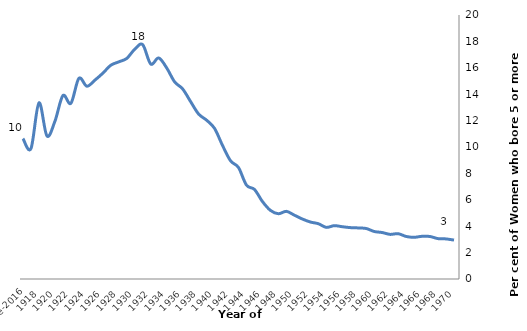
| Category | Series 0 |
|---|---|
| 1970 | 2.946 |
| 1969 | 3.037 |
| 1968 | 3.058 |
| 1967 | 3.218 |
| 1966 | 3.235 |
| 1965 | 3.158 |
| 1964 | 3.223 |
| 1963 | 3.433 |
| 1962 | 3.38 |
| 1961 | 3.522 |
| 1960 | 3.6 |
| 1959 | 3.825 |
| 1958 | 3.869 |
| 1957 | 3.893 |
| 1956 | 3.961 |
| 1955 | 4.042 |
| 1954 | 3.912 |
| 1953 | 4.189 |
| 1952 | 4.316 |
| 1951 | 4.544 |
| 1950 | 4.834 |
| 1949 | 5.125 |
| 1948 | 4.945 |
| 1947 | 5.198 |
| 1946 | 5.869 |
| 1945 | 6.783 |
| 1944 | 7.11 |
| 1943 | 8.443 |
| 1942 | 8.958 |
| 1941 | 10.115 |
| 1940 | 11.408 |
| 1939 | 12.032 |
| 1938 | 12.5 |
| 1937 | 13.44 |
| 1936 | 14.403 |
| 1935 | 14.932 |
| 1934 | 15.994 |
| 1933 | 16.745 |
| 1932 | 16.288 |
| 1931 | 17.749 |
| 1930 | 17.407 |
| 1929 | 16.711 |
| 1928 | 16.449 |
| 1927 | 16.194 |
| 1926 | 15.589 |
| 1925 | 15.06 |
| 1924 | 14.606 |
| 1923 | 15.199 |
| 1922 | 13.309 |
| 1921 | 13.894 |
| 1920 | 11.948 |
| 1919 | 10.837 |
| 1918 | 13.345 |
| 1917 | 9.882 |
| Pre-2016 | 10.638 |